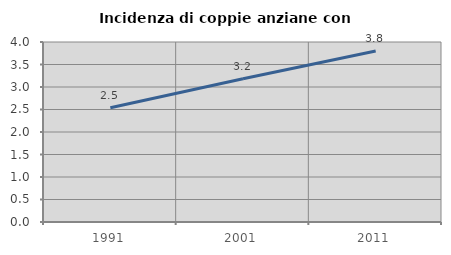
| Category | Incidenza di coppie anziane con figli |
|---|---|
| 1991.0 | 2.54 |
| 2001.0 | 3.185 |
| 2011.0 | 3.799 |